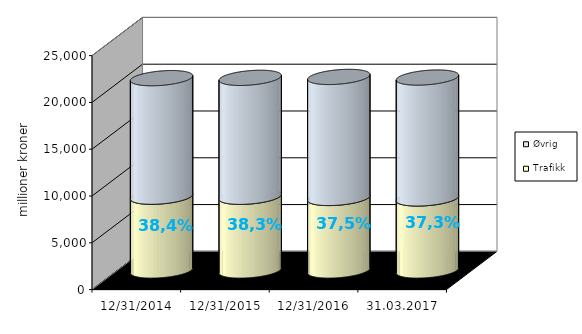
| Category | Trafikk | Øvrig |
|---|---|---|
| 31.12.2014 | 7884.668 | 12665.925 |
| 31.12.2015 | 7875.825 | 12707.863 |
| 31.12.2016 | 7750.819 | 12931.461 |
| 31.03.2017 | 7699.51 | 12915.94 |